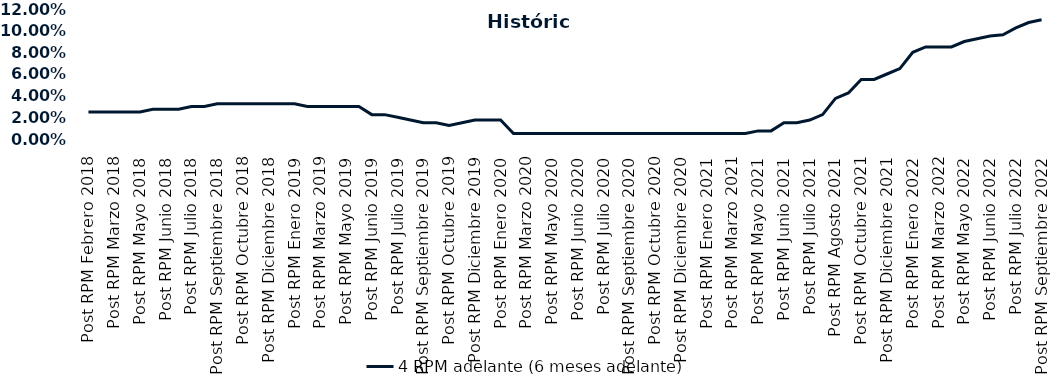
| Category | 4 RPM adelante (6 meses adelante) |
|---|---|
| Post RPM Febrero 2018 | 0.025 |
| Pre RPM Marzo 2018 | 0.025 |
| Post RPM Marzo 2018 | 0.025 |
| Pre RPM Mayo 2018 | 0.025 |
| Post RPM Mayo 2018 | 0.025 |
| Pre RPM Junio 2018 | 0.028 |
| Post RPM Junio 2018 | 0.028 |
| Pre RPM Julio 2018 | 0.028 |
| Post RPM Julio 2018 | 0.03 |
| Pre RPM Septiembre 2018 | 0.03 |
| Post RPM Septiembre 2018 | 0.032 |
| Pre RPM Octubre 2018 | 0.032 |
| Post RPM Octubre 2018 | 0.032 |
| Pre RPM Diciembre 2018 | 0.032 |
| Post RPM Diciembre 2018 | 0.032 |
| Pre RPM Enero 2019 | 0.032 |
| Post RPM Enero 2019 | 0.032 |
| Pre RPM Marzo 2019 | 0.03 |
| Post RPM Marzo 2019 | 0.03 |
| Pre RPM Mayo 2019 | 0.03 |
| Post RPM Mayo 2019 | 0.03 |
| Pre RPM Junio 2019 | 0.03 |
| Post RPM Junio 2019 | 0.022 |
| Pre RPM Julio 2019 | 0.022 |
| Post RPM Julio 2019 | 0.02 |
| Pre RPM Septiembre 2019 | 0.018 |
| Post RPM Septiembre 2019 | 0.015 |
| Pre RPM Octubre 2019 | 0.015 |
| Post RPM Octubre 2019 | 0.012 |
| Pre RPM Diciembre 2019 | 0.015 |
| Post RPM Diciembre 2019 | 0.018 |
| Pre RPM Enero 2020 | 0.018 |
| Post RPM Enero 2020 | 0.018 |
| Pre RPM Marzo 2020 | 0.005 |
| Post RPM Marzo 2020 | 0.005 |
| Pre RPM Mayo 2020 | 0.005 |
| Post RPM Mayo 2020 | 0.005 |
| Pre RPM Junio 2020 | 0.005 |
| Post RPM Junio 2020 | 0.005 |
| Pre RPM Julio 2020 | 0.005 |
| Post RPM Julio 2020 | 0.005 |
| Pre RPM Septiembre 2020 | 0.005 |
| Post RPM Septiembre 2020 | 0.005 |
| Pre RPM Octubre 2020 | 0.005 |
| Post RPM Octubre 2020 | 0.005 |
| Pre RPM Diciembre 2020 | 0.005 |
| Post RPM Diciembre 2020 | 0.005 |
| Pre RPM Enero 2021 | 0.005 |
| Post RPM Enero 2021 | 0.005 |
| Pre RPM Marzo 2021 | 0.005 |
| Post RPM Marzo 2021 | 0.005 |
| Pre RPM Mayo 2021 | 0.005 |
| Post RPM Mayo 2021 | 0.008 |
| Pre RPM Junio 2021 | 0.008 |
| Post RPM Junio 2021 | 0.015 |
| Pre RPM Julio 2021 | 0.015 |
| Post RPM Julio 2021 | 0.018 |
| Pre RPM Agosto 2021 | 0.022 |
| Post RPM Agosto 2021 | 0.038 |
| Pre RPM Octubre 2021 | 0.042 |
| Post RPM Octubre 2021 | 0.055 |
| Pre RPM Diciembre 2021 | 0.055 |
| Post RPM Diciembre 2021 | 0.06 |
| Pre RPM Enero 2022 | 0.065 |
| Post RPM Enero 2022 | 0.08 |
| Pre RPM Marzo 2022 | 0.085 |
| Post RPM Marzo 2022 | 0.085 |
| Pre RPM Mayo 2022 | 0.085 |
| Post RPM Mayo 2022 | 0.09 |
| Pre RPM Junio 2022 | 0.092 |
| Post RPM Junio 2022 | 0.095 |
| Pre RPM Julio 2022 | 0.096 |
| Post RPM Julio 2022 | 0.102 |
| Pre RPM Septiembre 2022 | 0.108 |
| Post RPM Septiembre 2022 | 0.11 |